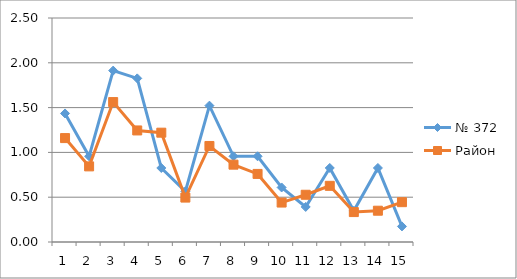
| Category | № 372 | Район |
|---|---|---|
| 0 | 1.435 | 1.16 |
| 1 | 0.957 | 0.844 |
| 2 | 1.913 | 1.562 |
| 3 | 1.826 | 1.245 |
| 4 | 0.826 | 1.22 |
| 5 | 0.565 | 0.496 |
| 6 | 1.522 | 1.072 |
| 7 | 0.957 | 0.863 |
| 8 | 0.957 | 0.76 |
| 9 | 0.609 | 0.44 |
| 10 | 0.391 | 0.527 |
| 11 | 0.826 | 0.627 |
| 12 | 0.348 | 0.334 |
| 13 | 0.826 | 0.349 |
| 14 | 0.174 | 0.445 |